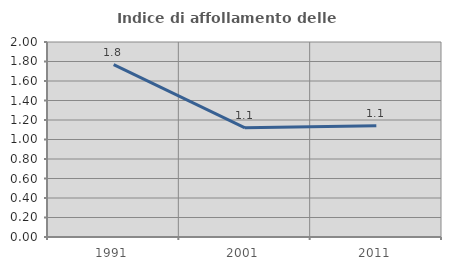
| Category | Indice di affollamento delle abitazioni  |
|---|---|
| 1991.0 | 1.767 |
| 2001.0 | 1.119 |
| 2011.0 | 1.142 |